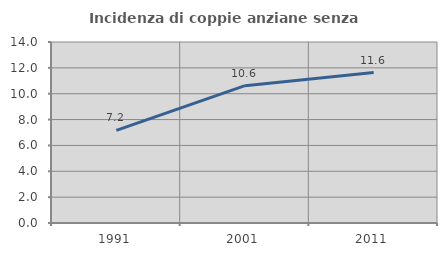
| Category | Incidenza di coppie anziane senza figli  |
|---|---|
| 1991.0 | 7.163 |
| 2001.0 | 10.62 |
| 2011.0 | 11.636 |